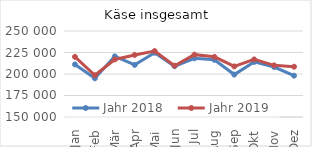
| Category | Jahr 2018 | Jahr 2019 |
|---|---|---|
| Jan | 211137.545 | 219937.91 |
| Feb | 194991.209 | 198539.34 |
| Mär | 220505.707 | 216900.825 |
| Apr | 210609.566 | 222165.991 |
| Mai | 224739.216 | 226678.674 |
| Jun | 209017.392 | 209664.665 |
| Jul | 218172.197 | 222500.384 |
| Aug | 216497.637 | 219956.596 |
| Sep | 199326.98 | 208802.187 |
| Okt | 214088.246 | 216941.01 |
| Nov | 208117.626 | 210033.927 |
| Dez | 198031.172 | 208443.254 |